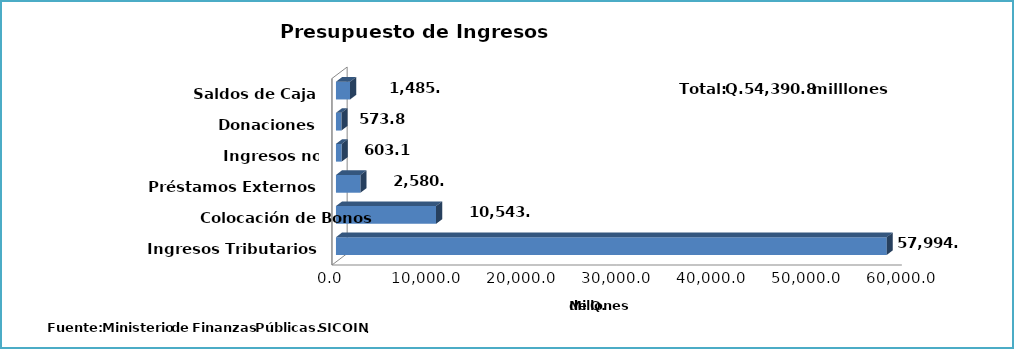
| Category | Series 0 |
|---|---|
| Ingresos Tributarios | 57994.8 |
| Colocación de Bonos | 10543.5 |
| Préstamos Externos | 2580.7 |
| Ingresos no Tributarios | 603.1 |
| Donaciones | 573.8 |
| Saldos de Caja | 1485 |